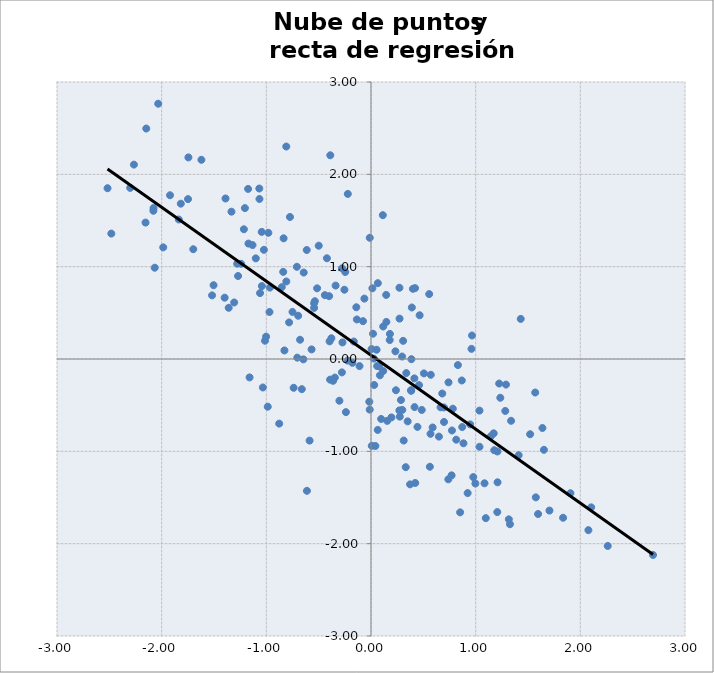
| Category | Series 0 |
|---|---|
| -2.0776028447490313 | 1.635 |
| -2.0791541842523706 | 1.605 |
| 1.3384414834530634 | -0.669 |
| 1.2896588873106072 | -0.277 |
| 0.2989761848749042 | -0.552 |
| 0.38419606717985544 | -0.345 |
| -0.011789199440346367 | 1.313 |
| 0.2727359538229833 | 0.437 |
| -0.8096967572843972 | 2.301 |
| -1.0656470947003398 | 1.733 |
| -0.7390493657586092 | -0.312 |
| 0.23311125851053816 | 0.083 |
| 0.7819884980913374 | -0.538 |
| 0.2716404094907282 | 0.771 |
| 1.705021509381464 | -1.641 |
| 0.29700997037241206 | 0.027 |
| 0.45882539079144613 | -0.283 |
| 0.18051292353995063 | 0.271 |
| 0.005263659499916452 | 0.108 |
| -0.9659024359960751 | 0.773 |
| 0.883415735101714 | -0.913 |
| -0.8523977578330209 | 0.778 |
| 0.9232233156120087 | -1.452 |
| 0.2752585746834868 | -0.624 |
| 0.40026152469036524 | 0.76 |
| 0.05358569538234932 | 0.1 |
| -0.25401181379641524 | 0.75 |
| 0.15479986683508073 | -0.67 |
| 0.3125519181771116 | -0.883 |
| 0.17867741648632401 | 0.205 |
| 0.019254469547739538 | 0.274 |
| 0.6967766421804651 | -0.525 |
| -0.012096661517382867 | -0.548 |
| -0.5363396600482417 | 0.626 |
| -1.5041602181480602 | 0.799 |
| -1.17055076036777 | 1.25 |
| 0.38609325044713405 | -0.002 |
| -0.0632829780514717 | 0.654 |
| -1.0599083714871558 | 0.714 |
| 1.3277686971264262 | -1.79 |
| -2.300893548602753 | 1.853 |
| -1.2408904681619255 | 1.031 |
| 0.28609977680391774 | -0.444 |
| 0.9600425298741304 | 0.11 |
| 1.0368168637412785 | -0.951 |
| -2.154118582999235 | 1.478 |
| -1.1007819717888139 | 1.09 |
| -0.6460073398422235 | -0.004 |
| -0.1638740696433056 | 0.189 |
| 0.23819028935016473 | -0.339 |
| -0.10986064062154277 | -0.077 |
| -0.3622806072563032 | -0.236 |
| 1.1455134601200374 | -0.836 |
| 1.6520302592158447 | -0.983 |
| 0.9771053790128204 | -1.279 |
| 0.5561625212088037 | 0.703 |
| -1.3898885992245353 | 1.738 |
| -0.8090422712292153 | 0.839 |
| 0.42083437129975576 | 0.768 |
| -0.3018811211540213 | -0.452 |
| 0.5684746982114766 | -0.811 |
| 0.07786431423706189 | -0.08 |
| 1.1724656575839174 | -0.805 |
| -0.986472826419285 | -0.516 |
| 1.4106823030029294 | -1.042 |
| 0.4228461728421208 | -1.343 |
| -1.033017673728112 | -0.308 |
| 1.0364265694417387 | -0.559 |
| -1.3331993298934535 | 1.595 |
| 0.9973576686508336 | -1.348 |
| -1.6203876125754388 | 2.157 |
| -0.2779499835052378 | -0.145 |
| 0.4847452046785904 | -0.552 |
| 1.835279270328261 | -1.719 |
| -1.214478905354338 | 1.405 |
| 0.697574428688507 | -0.682 |
| 0.7736183806451074 | -0.774 |
| 0.7389296460172701 | -1.303 |
| 0.11662795171100143 | -0.13 |
| -1.1601589714973208 | -0.199 |
| 1.905445119551048 | -1.454 |
| -0.5868442555575821 | -0.884 |
| 1.3170629705303272 | -1.737 |
| 0.026813423566316427 | 0.004 |
| 0.11293825883619563 | 1.558 |
| 0.5058025302778459 | -0.156 |
| -0.9697562958343129 | 0.509 |
| -0.2725680274452402 | 0.179 |
| -1.359584338785667 | 0.554 |
| -1.8170610243431264 | 1.682 |
| -0.8386458712601641 | 0.944 |
| -0.7042018426214853 | 0.015 |
| -0.6612494399140643 | -0.327 |
| -0.24586897590978068 | 0.942 |
| 1.59645949891312 | -1.679 |
| 0.19501184221034862 | -0.633 |
| 0.14526437926129354 | 0.694 |
| -0.6123358998164512 | -1.427 |
| 1.2091246387603811 | -1.335 |
| 0.6807286908052959 | -0.374 |
| -0.23965501569629793 | -0.576 |
| -1.0127305750341176 | 0.198 |
| 0.01313771748984011 | 0.766 |
| 0.09701569838936497 | -0.649 |
| -1.6980042397783577 | 1.189 |
| 0.11633107448059257 | 0.352 |
| -1.9200662021995565 | 1.773 |
| -0.8349318669679877 | 1.307 |
| 2.6947729903639726 | -2.123 |
| 1.5203916686554662 | -0.815 |
| 0.35022105042411766 | -0.675 |
| -0.9804131819753767 | 1.367 |
| -2.265063494000028 | 2.105 |
| -0.22356874589708442 | -0.018 |
| 1.2354419478192007 | -0.42 |
| 0.3824536879883199 | -0.338 |
| 2.2616257824975374 | -2.025 |
| -0.3957666059797391 | 0.191 |
| -0.4407020176831755 | 0.691 |
| 1.1777446801855835 | -0.988 |
| -0.13489485847978455 | 0.428 |
| 2.0770967548134873 | -1.854 |
| -0.5438928581966298 | 0.603 |
| -1.518497060704326 | 0.689 |
| 0.3318180340043798 | -1.171 |
| -1.0443492337713303 | 1.376 |
| -1.3073912206348979 | 0.612 |
| -0.5148686044591724 | 0.765 |
| -0.8271287979787867 | 0.093 |
| -0.3784512103998575 | 0.225 |
| 0.06402197554658157 | -0.768 |
| -0.016305489990106226 | -0.463 |
| -0.7499402136143791 | 0.51 |
| -0.07653526472118838 | 0.41 |
| 0.39041638968579717 | 0.558 |
| 0.5710106426759765 | -0.171 |
| 0.2711451405707448 | -0.557 |
| -0.6775928201890609 | 0.209 |
| -0.276737032539061 | 0.982 |
| 0.8675267212202 | -0.233 |
| 0.042086980064467566 | -0.942 |
| -0.6957149815174324 | 0.469 |
| -1.0427404827318538 | 0.79 |
| 0.373324796165753 | -1.358 |
| 0.7701182864629534 | -1.26 |
| 0.030575714705879935 | -0.281 |
| 0.5887209086014744 | -0.742 |
| -0.708253097930988 | 0.999 |
| -2.033037792935941 | 2.765 |
| -0.39982047242888663 | 0.681 |
| -2.4810644289098374 | 1.358 |
| 0.007259368782628789 | -0.94 |
| -1.3982244375158195 | 0.664 |
| 1.2830464827508208 | -0.563 |
| -1.2048171607194034 | 1.634 |
| 0.4439050315633032 | -0.736 |
| -2.0662637393297407 | 0.989 |
| -0.8770196275891546 | -0.7 |
| 0.46472012341133306 | 0.474 |
| 1.2067646779520484 | -1.658 |
| -1.2786254958131118 | 1.032 |
| -0.38908259051214944 | 2.206 |
| 1.6379816809428385 | -0.747 |
| 2.103582080880704 | -1.607 |
| 0.9651126931243359 | 0.255 |
| -1.985152140454984 | 1.209 |
| -1.0022662977690104 | 0.243 |
| 0.33718272890974 | -0.152 |
| 0.14698021913614834 | 0.402 |
| -0.5434748911822762 | 0.553 |
| 0.41437318584305793 | -0.21 |
| -0.7825581137767266 | 0.396 |
| 1.0845574575362704 | -1.346 |
| -1.7484163159608626 | 1.731 |
| 1.5747628769594129 | -1.499 |
| 1.0965480733827957 | -1.724 |
| -0.614227294971363 | 1.18 |
| -0.3379793169935159 | 0.795 |
| 0.8301073413711904 | -0.066 |
| -0.34537780184609057 | -0.201 |
| 1.430365235571967 | 0.434 |
| -1.0672650807459552 | 1.846 |
| 0.814396847635217 | -0.874 |
| -0.4994488901384915 | 1.227 |
| -0.4210047262672697 | 1.091 |
| -0.5677755932766075 | 0.104 |
| -2.147337013164525 | 2.496 |
| -0.1779127602476155 | -0.042 |
| 1.568820126196524 | -0.363 |
| 0.8715868999426066 | -0.737 |
| 0.08545465549952677 | -0.177 |
| -0.14017745905426393 | 0.56 |
| 0.9471039504064658 | -0.708 |
| 0.06537368607878324 | 0.821 |
| -0.22168154838137272 | 1.788 |
| 0.649037616991921 | -0.84 |
| -2.517291036484896 | 1.85 |
| 0.058985933104258634 | -0.077 |
| 0.3069824381601465 | 0.197 |
| 1.224379420699202 | -0.266 |
| 0.7405372480728654 | -0.253 |
| -1.2699437685651285 | 0.899 |
| 0.5623937060850204 | -1.167 |
| 1.2076800848281994 | -1.002 |
| -1.7446634774907182 | 2.183 |
| -1.8362570308746418 | 1.511 |
| -0.6427805609156596 | 0.936 |
| 0.8513482055356372 | -1.661 |
| -1.131784977319716 | 1.234 |
| -1.0234667810880311 | 1.183 |
| -1.1740575215691949 | 1.842 |
| 0.664673601401494 | -0.523 |
| 0.41605861179891535 | -0.521 |
| -0.7742862873021694 | 1.538 |
| -0.390934825738925 | -0.223 |